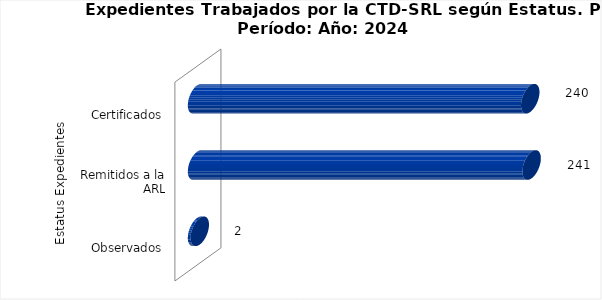
| Category | Total |
|---|---|
| 0 | 2 |
| 1 | 241 |
| 2 | 240 |